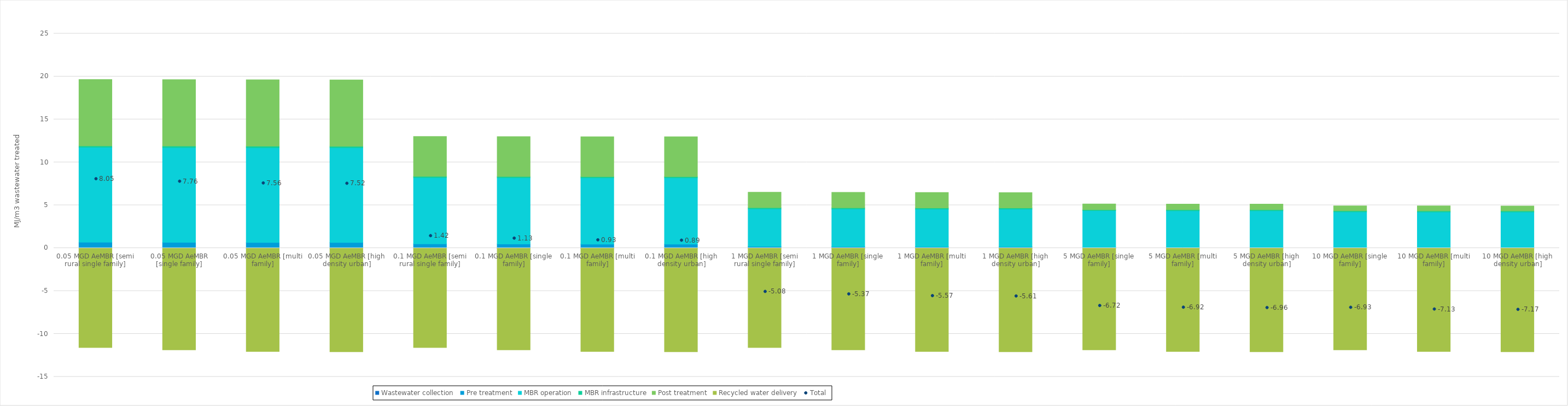
| Category | Wastewater collection | Pre treatment | MBR operation | MBR infrastructure | Post treatment | Recycled water delivery |
|---|---|---|---|---|---|---|
| 0.05 MGD AeMBR [semi rural single family] | 0.04 | 0.65 | 11.057 | 0.161 | 7.739 | -11.592 |
| 0.05 MGD AeMBR [single family] | 0.021 | 0.65 | 11.057 | 0.161 | 7.739 | -11.862 |
| 0.05 MGD AeMBR [multi family] | 0.005 | 0.65 | 11.057 | 0.161 | 7.739 | -12.047 |
| 0.05 MGD AeMBR [high density urban] | 0.003 | 0.65 | 11.057 | 0.161 | 7.739 | -12.085 |
| 0.1 MGD AeMBR [semi rural single family] | 0.038 | 0.452 | 7.726 | 0.15 | 4.643 | -11.593 |
| 0.1 MGD AeMBR [single family] | 0.02 | 0.452 | 7.726 | 0.15 | 4.643 | -11.861 |
| 0.1 MGD AeMBR [multi family] | 0.005 | 0.452 | 7.726 | 0.15 | 4.643 | -12.048 |
| 0.1 MGD AeMBR [high density urban] | 0.003 | 0.452 | 7.726 | 0.15 | 4.643 | -12.085 |
| 1 MGD AeMBR [semi rural single family] | 0.04 | 0.143 | 4.393 | 0.139 | 1.794 | -11.593 |
| 1 MGD AeMBR [single family] | 0.02 | 0.143 | 4.393 | 0.139 | 1.794 | -11.861 |
| 1 MGD AeMBR [multi family] | 0.005 | 0.143 | 4.393 | 0.139 | 1.794 | -12.048 |
| 1 MGD AeMBR [high density urban] | 0.003 | 0.143 | 4.393 | 0.139 | 1.794 | -12.085 |
| 5 MGD AeMBR [single family] | 0.017 | 0.07 | 4.27 | 0.124 | 0.658 | -11.861 |
| 5 MGD AeMBR [multi family] | 0.005 | 0.07 | 4.27 | 0.124 | 0.658 | -12.048 |
| 5 MGD AeMBR [high density urban] | 0.003 | 0.07 | 4.27 | 0.124 | 0.658 | -12.085 |
| 10 MGD AeMBR [single family] | 0.02 | 0.053 | 4.151 | 0.123 | 0.58 | -11.861 |
| 10 MGD AeMBR [multi family] | 0.006 | 0.053 | 4.151 | 0.123 | 0.58 | -12.048 |
| 10 MGD AeMBR [high density urban] | 0.003 | 0.053 | 4.151 | 0.123 | 0.58 | -12.085 |